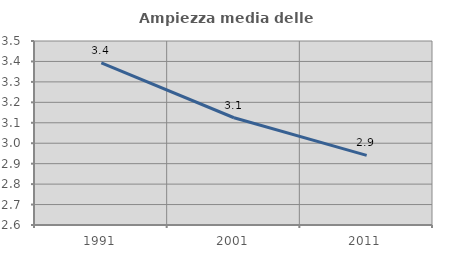
| Category | Ampiezza media delle famiglie |
|---|---|
| 1991.0 | 3.393 |
| 2001.0 | 3.125 |
| 2011.0 | 2.94 |